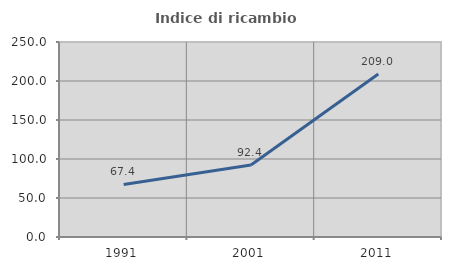
| Category | Indice di ricambio occupazionale  |
|---|---|
| 1991.0 | 67.408 |
| 2001.0 | 92.372 |
| 2011.0 | 209.05 |